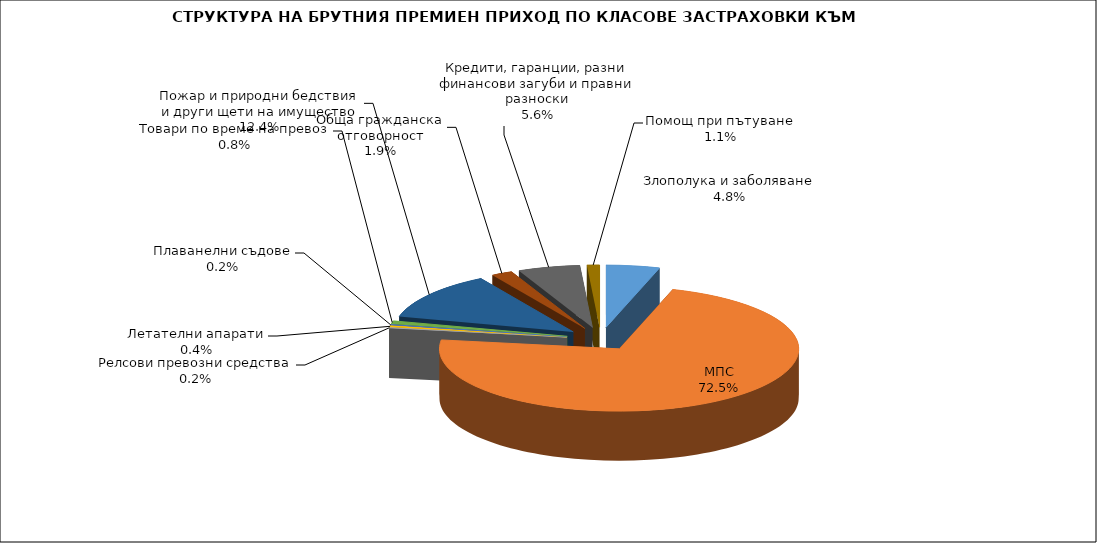
| Category | Злополука и заболяване |
|---|---|
| Злополука и заболяване | 0.048 |
| МПС | 0.725 |
| Релсови превозни средства | 0.002 |
| Летателни апарати | 0.004 |
| Плаванелни съдове | 0.002 |
| Товари по време на превоз | 0.008 |
| Пожар и природни бедствия и други щети на имущество | 0.124 |
| Обща гражданска отговорност | 0.019 |
| Кредити, гаранции, разни финансови загуби и правни разноски | 0.056 |
| Помощ при пътуване | 0.011 |